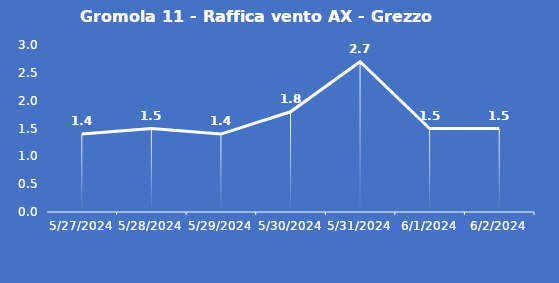
| Category | Gromola 11 - Raffica vento AX - Grezzo (m/s) |
|---|---|
| 5/27/24 | 1.4 |
| 5/28/24 | 1.5 |
| 5/29/24 | 1.4 |
| 5/30/24 | 1.8 |
| 5/31/24 | 2.7 |
| 6/1/24 | 1.5 |
| 6/2/24 | 1.5 |